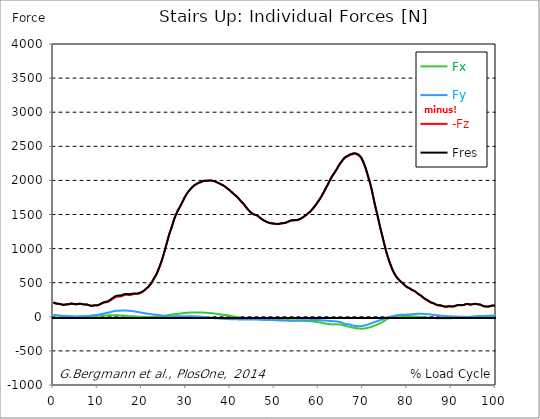
| Category |  Fx |  Fy |  -Fz |  Fres |
|---|---|---|---|---|
| 0.0 | -11.53 | 28.2 | 209.26 | 211.65 |
| 0.16678370786516855 | -11.85 | 26.92 | 203.89 | 206.22 |
| 0.3335674157303371 | -12.14 | 25.68 | 198.67 | 200.94 |
| 0.5003511235955057 | -12.11 | 24.81 | 194.82 | 197.05 |
| 0.6671348314606742 | -11.91 | 24.05 | 192.67 | 194.83 |
| 0.8339185393258427 | -11.54 | 23.12 | 191.37 | 193.39 |
| 1.0007022471910114 | -10.95 | 21.97 | 190.48 | 192.33 |
| 1.1674859550561796 | -10.47 | 20.67 | 189.67 | 191.36 |
| 1.3342696629213484 | -10.3 | 19.49 | 188.26 | 189.83 |
| 1.5010533707865168 | -10.23 | 18.35 | 186.27 | 187.77 |
| 1.6678370786516854 | -10.17 | 17.4 | 183.74 | 185.17 |
| 1.8346207865168538 | -9.87 | 16.62 | 180.96 | 182.32 |
| 2.001404494382023 | -9.23 | 15.96 | 177.73 | 179.05 |
| 2.1681882022471908 | -8.56 | 15.29 | 175.13 | 176.38 |
| 2.334971910112359 | -7.76 | 14.66 | 175.02 | 176.17 |
| 2.501755617977528 | -6.6 | 14.11 | 176.58 | 177.63 |
| 2.668539325842697 | -5.42 | 13.29 | 178.97 | 179.88 |
| 2.8353230337078656 | -4.76 | 12.3 | 181.16 | 181.97 |
| 3.0021067415730336 | -4.62 | 11.53 | 181.84 | 182.61 |
| 3.168890449438202 | -4.35 | 10.82 | 181.68 | 182.43 |
| 3.335674157303371 | -3.88 | 10.19 | 181.5 | 182.2 |
| 3.502457865168539 | -3 | 9.54 | 183.97 | 184.62 |
| 3.6692415730337076 | -2.32 | 8.86 | 186.81 | 187.4 |
| 3.8360252808988764 | -1.48 | 8.12 | 190.52 | 191.08 |
| 4.002808988764046 | -0.73 | 7.49 | 193.32 | 193.86 |
| 4.169592696629214 | -0.25 | 7.06 | 193.45 | 193.97 |
| 4.3363764044943816 | 0.02 | 6.71 | 191.63 | 192.14 |
| 4.50316011235955 | 0.16 | 6.46 | 189.56 | 190.06 |
| 4.669943820224718 | 0.22 | 6.24 | 186.83 | 187.33 |
| 4.836727528089888 | 0.41 | 6.04 | 184.47 | 184.98 |
| 5.003511235955056 | 1.09 | 5.85 | 183.72 | 184.24 |
| 5.170294943820225 | 2.03 | 5.68 | 183.88 | 184.4 |
| 5.337078651685394 | 2.83 | 5.51 | 184.93 | 185.46 |
| 5.5038623595505625 | 3.57 | 5.26 | 186.77 | 187.3 |
| 5.670646067415731 | 4.2 | 5 | 189.09 | 189.62 |
| 5.837429775280899 | 4.8 | 4.72 | 191.52 | 192.04 |
| 6.004213483146067 | 5.15 | 4.67 | 192.17 | 192.69 |
| 6.170997191011236 | 5.5 | 4.92 | 190.86 | 191.39 |
| 6.329002808988764 | 5.8 | 5.18 | 188.92 | 189.46 |
| 6.495786516853932 | 6.45 | 5.58 | 186.42 | 186.97 |
| 6.662570224719101 | 7.27 | 6.23 | 183.37 | 183.95 |
| 6.82935393258427 | 7.99 | 6.77 | 180.98 | 181.61 |
| 6.9961376404494375 | 8.83 | 7.29 | 179.75 | 180.42 |
| 7.162921348314607 | 9.81 | 7.88 | 180.15 | 180.88 |
| 7.329705056179775 | 10.69 | 8.44 | 180.88 | 181.66 |
| 7.496488764044945 | 11.32 | 9.16 | 180.33 | 181.18 |
| 7.663272471910113 | 11.72 | 10.31 | 178.37 | 179.3 |
| 7.830056179775281 | 11.96 | 11.38 | 175.39 | 176.42 |
| 7.996839887640449 | 12.17 | 12.72 | 170.87 | 172.01 |
| 8.16362359550562 | 12.41 | 14.17 | 166.08 | 167.35 |
| 8.330407303370787 | 12.75 | 15.5 | 163.52 | 164.95 |
| 8.497191011235955 | 13.21 | 16.71 | 161.16 | 162.76 |
| 8.663974719101123 | 13.78 | 17.84 | 159.85 | 161.63 |
| 8.830758426966291 | 14.47 | 19.03 | 160.84 | 162.78 |
| 8.99754213483146 | 14.98 | 20.22 | 162.57 | 164.66 |
| 9.16432584269663 | 15.39 | 21.44 | 164.92 | 167.16 |
| 9.331109550561798 | 15.43 | 22.6 | 166.81 | 169.17 |
| 9.497893258426966 | 15.16 | 23.74 | 166.94 | 169.43 |
| 9.664676966292134 | 15.2 | 25.47 | 167 | 169.76 |
| 9.831460674157304 | 15.25 | 27.19 | 167.06 | 170.09 |
| 9.998244382022472 | 15.59 | 29.2 | 167.78 | 171.17 |
| 10.16502808988764 | 16.48 | 31.2 | 170.35 | 174.12 |
| 10.331811797752808 | 17.33 | 33.19 | 174.3 | 178.43 |
| 10.498595505617978 | 18.17 | 35.19 | 178.6 | 183.06 |
| 10.665379213483147 | 18.86 | 37.42 | 183.95 | 188.78 |
| 10.832162921348315 | 19.4 | 39.78 | 190.25 | 195.45 |
| 10.998946629213483 | 19.91 | 42.1 | 196.43 | 202 |
| 11.165730337078653 | 20.2 | 44.24 | 201.2 | 207.11 |
| 11.33251404494382 | 20.15 | 46.4 | 205.15 | 211.43 |
| 11.49929775280899 | 20.08 | 48.52 | 208.09 | 214.76 |
| 11.666081460674157 | 20.11 | 51.11 | 210.44 | 217.62 |
| 11.832865168539326 | 19.78 | 53.08 | 212.08 | 219.65 |
| 11.999648876404493 | 19.45 | 54.77 | 213.67 | 221.59 |
| 12.166432584269662 | 19.33 | 56.78 | 215.73 | 224.08 |
| 12.333216292134832 | 19.87 | 59.42 | 219.41 | 228.32 |
| 12.5 | 20.54 | 61.94 | 223.96 | 233.4 |
| 12.66678370786517 | 21.35 | 64.41 | 229.94 | 239.85 |
| 12.833567415730336 | 22.28 | 67.04 | 237.09 | 247.49 |
| 13.000351123595506 | 22.98 | 70.6 | 245.46 | 256.53 |
| 13.167134831460674 | 23.64 | 73.94 | 252.72 | 264.45 |
| 13.333918539325843 | 23.88 | 76.59 | 258.98 | 271.19 |
| 13.500702247191011 | 23.79 | 79.46 | 265.44 | 278.16 |
| 13.667485955056181 | 23.72 | 82.22 | 273.32 | 286.46 |
| 13.834269662921349 | 23.56 | 84.86 | 280.96 | 294.5 |
| 14.001053370786519 | 22.9 | 86.74 | 286.8 | 300.56 |
| 14.167837078651687 | 22.5 | 88.15 | 290.75 | 304.7 |
| 14.334620786516853 | 22.04 | 89.34 | 294.08 | 308.18 |
| 14.501404494382026 | 21.61 | 90.05 | 296.43 | 310.61 |
| 14.668188202247192 | 21.07 | 90.44 | 297.92 | 312.13 |
| 14.834971910112362 | 20.11 | 90.42 | 298.1 | 312.27 |
| 15.001755617977528 | 19.2 | 90.41 | 298.14 | 312.28 |
| 15.168539325842698 | 18.28 | 90.4 | 298.18 | 312.29 |
| 15.335323033707864 | 17.87 | 90.65 | 300.26 | 314.33 |
| 15.502106741573034 | 17.67 | 91.23 | 303.4 | 317.48 |
| 15.6688904494382 | 17.47 | 91.64 | 307.68 | 321.67 |
| 15.83567415730337 | 17.3 | 92.14 | 313.07 | 326.96 |
| 16.00245786516854 | 16.92 | 92.4 | 317.91 | 331.64 |
| 16.16924157303371 | 16.34 | 92.28 | 321.18 | 334.7 |
| 16.336025280898877 | 15.47 | 91.83 | 322.29 | 335.61 |
| 16.502808988764045 | 14.14 | 91.17 | 322.59 | 335.67 |
| 16.669592696629216 | 12.83 | 90.31 | 321.85 | 334.69 |
| 16.83637640449438 | 11.35 | 89.34 | 320.61 | 333.23 |
| 17.003160112359552 | 10.04 | 88.56 | 319.79 | 332.24 |
| 17.169943820224717 | 8.72 | 87.62 | 319.48 | 331.72 |
| 17.336727528089888 | 7.65 | 86.52 | 320.14 | 332.08 |
| 17.503511235955056 | 7.27 | 85.42 | 322.07 | 333.68 |
| 17.670294943820224 | 6.84 | 84.33 | 324.19 | 335.49 |
| 17.837078651685395 | 7 | 83.11 | 327.18 | 338.1 |
| 18.003862359550563 | 7.2 | 81.86 | 329.95 | 340.5 |
| 18.17064606741573 | 7.14 | 80.52 | 332.22 | 342.4 |
| 18.3374297752809 | 6.6 | 79 | 333.69 | 343.48 |
| 18.504213483146067 | 5.58 | 77.34 | 333.86 | 343.29 |
| 18.662219101123597 | 4.34 | 75.5 | 333.69 | 342.7 |
| 18.829002808988765 | 3.09 | 73.54 | 333.43 | 341.99 |
| 18.995786516853933 | 2.38 | 71.62 | 334.63 | 342.77 |
| 19.1625702247191 | 1.97 | 69.23 | 337.27 | 344.86 |
| 19.32935393258427 | 1.71 | 67.2 | 340.71 | 347.81 |
| 19.49613764044944 | 1.45 | 65.47 | 344.96 | 351.69 |
| 19.662921348314608 | 1.04 | 63.82 | 349.07 | 355.51 |
| 19.829705056179776 | 0.69 | 61.86 | 354.92 | 360.94 |
| 19.996488764044944 | 0.36 | 60.01 | 360.39 | 366.09 |
| 20.163272471910112 | -0.09 | 58.17 | 365.56 | 371 |
| 20.33005617977528 | -0.67 | 56.21 | 372.01 | 377.11 |
| 20.49683988764045 | -1.11 | 54.13 | 381.02 | 385.7 |
| 20.663623595505616 | -1.42 | 52.07 | 390.7 | 394.96 |
| 20.830407303370787 | -1.24 | 49.99 | 401.25 | 405.16 |
| 20.997191011235955 | -1.34 | 48.53 | 410.74 | 414.52 |
| 21.163974719101123 | -1.66 | 47.34 | 418.29 | 421.99 |
| 21.330758426966295 | -1.79 | 45.78 | 427.77 | 431.27 |
| 21.497542134831463 | -1.61 | 43.83 | 440.27 | 443.47 |
| 21.66432584269663 | -1.6 | 42.38 | 452.3 | 455.33 |
| 21.8311095505618 | -1.64 | 41.01 | 463.98 | 466.84 |
| 21.997893258426966 | -1.3 | 38.81 | 480.29 | 482.84 |
| 22.164676966292134 | -1.5 | 37.39 | 496.54 | 498.99 |
| 22.331460674157306 | -1.65 | 36.09 | 512.24 | 514.59 |
| 22.498244382022467 | -1.22 | 34.05 | 531.66 | 533.73 |
| 22.66502808988764 | -0.92 | 32.22 | 551.36 | 553.19 |
| 22.831811797752806 | -0.66 | 31 | 570.56 | 572.27 |
| 22.99859550561798 | -0.4 | 30.18 | 588.59 | 590.21 |
| 23.165379213483146 | -0.15 | 29.59 | 605.98 | 607.51 |
| 23.332162921348313 | 0.1 | 29.29 | 625.87 | 627.31 |
| 23.49894662921348 | 0.55 | 27.98 | 651.34 | 652.64 |
| 23.665730337078653 | 1.51 | 26.26 | 678.41 | 679.55 |
| 23.83251404494382 | 2.8 | 24.74 | 705.53 | 706.54 |
| 23.999297752808985 | 4.63 | 23.78 | 732.58 | 733.52 |
| 24.166081460674157 | 5.95 | 22.74 | 760.57 | 761.45 |
| 24.332865168539325 | 6.86 | 21.19 | 791.42 | 792.22 |
| 24.499648876404496 | 7.64 | 19.65 | 823.54 | 824.27 |
| 24.666432584269664 | 8.87 | 17.79 | 858.5 | 859.16 |
| 24.833216292134832 | 10.22 | 15.81 | 894.52 | 895.12 |
| 25.0 | 11.71 | 14.44 | 929.39 | 929.95 |
| 25.16678370786517 | 13.39 | 13.22 | 966.57 | 967.13 |
| 25.33356741573034 | 15.62 | 11.97 | 1007.73 | 1008.3 |
| 25.500351123595504 | 18.11 | 10.97 | 1047.04 | 1047.64 |
| 25.66713483146067 | 20.63 | 10.33 | 1086.83 | 1087.48 |
| 25.833918539325843 | 22.8 | 9.66 | 1124.01 | 1124.72 |
| 26.00070224719101 | 25.61 | 8.37 | 1165.04 | 1165.81 |
| 26.16748595505618 | 27.84 | 7.18 | 1201.9 | 1202.73 |
| 26.334269662921347 | 29.58 | 6.49 | 1235.37 | 1236.25 |
| 26.50105337078652 | 30.51 | 6.06 | 1266.2 | 1267.09 |
| 26.667837078651687 | 31.84 | 5.84 | 1297.53 | 1298.46 |
| 26.834620786516858 | 33.7 | 5.69 | 1331.02 | 1332 |
| 27.001404494382022 | 35.36 | 5.87 | 1365.53 | 1366.56 |
| 27.16818820224719 | 36.86 | 6.39 | 1401.2 | 1402.26 |
| 27.334971910112362 | 38.31 | 6.75 | 1433.63 | 1434.72 |
| 27.50175561797753 | 39.43 | 6.74 | 1461.88 | 1462.99 |
| 27.668539325842698 | 40.43 | 6.62 | 1489.05 | 1490.18 |
| 27.835323033707866 | 41.24 | 6.46 | 1512.89 | 1514.02 |
| 28.002106741573037 | 42.17 | 6.46 | 1535.62 | 1536.76 |
| 28.168890449438205 | 43.15 | 6.65 | 1558.9 | 1560.05 |
| 28.335674157303373 | 44.18 | 7.16 | 1579.68 | 1580.82 |
| 28.502457865168537 | 45.2 | 7.78 | 1598.18 | 1599.3 |
| 28.669241573033705 | 46.36 | 8.4 | 1617.88 | 1618.99 |
| 28.836025280898877 | 47.55 | 8.64 | 1639.36 | 1640.47 |
| 29.002808988764052 | 49.2 | 8 | 1661.37 | 1662.48 |
| 29.169592696629213 | 50.99 | 7.25 | 1683.02 | 1684.12 |
| 29.336376404494384 | 52.84 | 6.61 | 1704.06 | 1705.16 |
| 29.50316011235955 | 54.66 | 6.09 | 1725.09 | 1726.2 |
| 29.669943820224724 | 56.05 | 6.79 | 1746.66 | 1747.79 |
| 29.836727528089884 | 57.79 | 6.92 | 1766.13 | 1767.28 |
| 30.003511235955056 | 58.81 | 7.18 | 1784.71 | 1785.87 |
| 30.170294943820224 | 59.6 | 7.17 | 1801.99 | 1803.16 |
| 30.337078651685395 | 60.45 | 6.77 | 1817.42 | 1818.6 |
| 30.503862359550563 | 61.04 | 6.68 | 1832.06 | 1833.25 |
| 30.670646067415728 | 61.26 | 6.48 | 1846.29 | 1847.47 |
| 30.837429775280903 | 61.69 | 6.21 | 1859.22 | 1860.41 |
| 30.99543539325843 | 62.24 | 6.41 | 1871.56 | 1872.75 |
| 31.162219101123597 | 62.76 | 6.88 | 1883.72 | 1884.92 |
| 31.32900280898876 | 62.89 | 7.29 | 1895.42 | 1896.61 |
| 31.495786516853936 | 62.83 | 7.54 | 1906.65 | 1907.83 |
| 31.6625702247191 | 63.19 | 7 | 1916.3 | 1917.48 |
| 31.82935393258427 | 63.29 | 6.58 | 1925.45 | 1926.63 |
| 31.996137640449433 | 63.01 | 6.32 | 1933.11 | 1934.27 |
| 32.162921348314605 | 62.94 | 5.93 | 1939.73 | 1940.88 |
| 32.329705056179776 | 63.16 | 5.63 | 1945.54 | 1946.69 |
| 32.49648876404494 | 63.76 | 5.26 | 1950.93 | 1952.1 |
| 32.66327247191011 | 64.03 | 4.88 | 1957.94 | 1959.12 |
| 32.83005617977528 | 63.1 | 4.5 | 1965 | 1966.13 |
| 32.996839887640455 | 62.64 | 3.87 | 1968.81 | 1969.92 |
| 33.16362359550562 | 62.67 | 2.98 | 1971.33 | 1972.44 |
| 33.330407303370784 | 62.82 | 2.09 | 1973.45 | 1974.56 |
| 33.497191011235955 | 62.64 | 1.18 | 1976.88 | 1977.98 |
| 33.66397471910113 | 62.46 | -0.04 | 1983.46 | 1984.55 |
| 33.83075842696629 | 62.15 | -1.06 | 1989.57 | 1990.64 |
| 33.997542134831455 | 61.23 | -1.78 | 1993.4 | 1994.44 |
| 34.164325842696634 | 60.39 | -2.81 | 1994.92 | 1995.93 |
| 34.3311095505618 | 59.66 | -3.89 | 1995.69 | 1996.69 |
| 34.49789325842697 | 59.14 | -4.83 | 1995.2 | 1996.18 |
| 34.66467696629213 | 58.66 | -5.76 | 1994.47 | 1995.45 |
| 34.831460674157306 | 58.05 | -6.66 | 1994.34 | 1995.3 |
| 34.99824438202247 | 57.16 | -7.71 | 1995.36 | 1996.3 |
| 35.16502808988764 | 56.14 | -9.06 | 1997.15 | 1998.08 |
| 35.331811797752806 | 55.16 | -10.35 | 1998.65 | 1999.55 |
| 35.49859550561798 | 54.31 | -11.45 | 1998.49 | 1999.38 |
| 35.66537921348315 | 53.59 | -12.59 | 1997.33 | 1998.21 |
| 35.83216292134831 | 52.98 | -13.96 | 1994.9 | 1995.78 |
| 35.998946629213485 | 52.28 | -15.37 | 1992.03 | 1992.91 |
| 36.16573033707865 | 50.98 | -16.64 | 1990.91 | 1991.78 |
| 36.33251404494382 | 49.63 | -17.93 | 1989.81 | 1990.66 |
| 36.499297752808985 | 47.76 | -19.13 | 1986.02 | 1986.84 |
| 36.666081460674164 | 45.8 | -20.57 | 1982.01 | 1982.81 |
| 36.83286516853932 | 43.85 | -21.72 | 1976.86 | 1977.64 |
| 36.99964887640449 | 41.7 | -22.59 | 1971.07 | 1971.81 |
| 37.166432584269664 | 39.97 | -23.36 | 1966 | 1966.74 |
| 37.333216292134836 | 38.34 | -24.05 | 1960.74 | 1961.46 |
| 37.5 | 36.91 | -24.49 | 1955.01 | 1955.73 |
| 37.666783707865164 | 35.86 | -25.33 | 1949.31 | 1950.02 |
| 37.833567415730336 | 34.75 | -26.09 | 1943.67 | 1944.38 |
| 38.00035112359551 | 33.2 | -26.87 | 1939.57 | 1940.26 |
| 38.16713483146068 | 31.5 | -27.81 | 1935.5 | 1936.16 |
| 38.333918539325836 | 29.54 | -28.61 | 1929.4 | 1930.05 |
| 38.50070224719101 | 27.8 | -29.39 | 1923.01 | 1923.65 |
| 38.66748595505618 | 26.21 | -30.37 | 1916.09 | 1916.72 |
| 38.83426966292135 | 24.91 | -31.26 | 1907.55 | 1908.18 |
| 39.001053370786515 | 24.05 | -32.04 | 1898.22 | 1898.86 |
| 39.16783707865169 | 22.89 | -32.59 | 1889.38 | 1890 |
| 39.33462078651686 | 21.49 | -33.18 | 1881.83 | 1882.44 |
| 39.50140449438202 | 19.97 | -33.57 | 1874.65 | 1875.25 |
| 39.668188202247194 | 18.2 | -34.14 | 1866.28 | 1866.87 |
| 39.83497191011236 | 16.24 | -34.69 | 1856.79 | 1857.37 |
| 40.00175561797753 | 14.24 | -35.11 | 1847.25 | 1847.83 |
| 40.168539325842694 | 12.23 | -35.4 | 1837.53 | 1838.09 |
| 40.335323033707866 | 10.39 | -35.66 | 1827.43 | 1827.99 |
| 40.50210674157304 | 8.51 | -35.98 | 1817.2 | 1817.77 |
| 40.6688904494382 | 6.63 | -36.33 | 1806.76 | 1807.32 |
| 40.83567415730337 | 4.81 | -36.69 | 1796.21 | 1796.78 |
| 41.00245786516854 | 2.81 | -37.08 | 1788.51 | 1789.08 |
| 41.16924157303371 | 0.85 | -37.44 | 1780.48 | 1781.05 |
| 41.33602528089887 | -0.97 | -37.6 | 1770.71 | 1771.28 |
| 41.502808988764045 | -2.84 | -37.67 | 1760.05 | 1760.63 |
| 41.669592696629216 | -4.66 | -37.8 | 1749.42 | 1750.01 |
| 41.83637640449439 | -6.42 | -38 | 1738.67 | 1739.27 |
| 42.00316011235955 | -8.42 | -38.4 | 1726.61 | 1727.23 |
| 42.16994382022472 | -10.52 | -39.23 | 1712.52 | 1713.17 |
| 42.33672752808989 | -12.2 | -39.85 | 1699.39 | 1700.08 |
| 42.50351123595506 | -13.58 | -40.23 | 1686.78 | 1687.5 |
| 42.670294943820224 | -14.84 | -40.61 | 1676.33 | 1677.07 |
| 42.83707865168539 | -16.59 | -40.33 | 1666.25 | 1667 |
| 43.00386235955057 | -18.37 | -40.08 | 1656.01 | 1656.77 |
| 43.17064606741573 | -20 | -39.57 | 1642.65 | 1643.43 |
| 43.32865168539326 | -21.41 | -39.24 | 1627.77 | 1628.57 |
| 43.495435393258425 | -22.45 | -39.19 | 1612.62 | 1613.44 |
| 43.6622191011236 | -23.17 | -38.99 | 1598.61 | 1599.44 |
| 43.82900280898876 | -23.46 | -38.59 | 1586.17 | 1587 |
| 43.99578651685393 | -23.9 | -38.78 | 1573.88 | 1574.73 |
| 44.162570224719104 | -24.35 | -39.04 | 1561.73 | 1562.6 |
| 44.32935393258427 | -24.77 | -39.3 | 1549.96 | 1550.86 |
| 44.49613764044944 | -25.19 | -39.56 | 1538.2 | 1539.11 |
| 44.66292134831461 | -26.04 | -39.97 | 1528.07 | 1529.02 |
| 44.82970505617978 | -27.09 | -40.07 | 1518.85 | 1519.84 |
| 44.99648876404493 | -28.22 | -40.05 | 1511.41 | 1512.42 |
| 45.16327247191011 | -29.37 | -39.99 | 1504.79 | 1505.83 |
| 45.33005617977528 | -30.45 | -40.09 | 1500.54 | 1501.61 |
| 45.49683988764045 | -31.46 | -40.21 | 1496.87 | 1497.96 |
| 45.66362359550561 | -32.24 | -40.23 | 1492.44 | 1493.55 |
| 45.83040730337079 | -33.39 | -40.44 | 1490.51 | 1491.65 |
| 45.99719101123596 | -34.57 | -40.67 | 1488.72 | 1489.88 |
| 46.16397471910113 | -35.54 | -40.42 | 1483.33 | 1484.5 |
| 46.33075842696629 | -36.25 | -39.82 | 1473.62 | 1474.81 |
| 46.497542134831455 | -36.53 | -40.44 | 1463.19 | 1464.41 |
| 46.66432584269663 | -37.17 | -40.67 | 1454.61 | 1455.87 |
| 46.83110955056179 | -37.42 | -41.26 | 1446.27 | 1447.57 |
| 46.99789325842696 | -37.95 | -41.51 | 1437.17 | 1438.51 |
| 47.164676966292134 | -38.47 | -41.74 | 1429.46 | 1430.82 |
| 47.331460674157306 | -39.27 | -41.64 | 1422.44 | 1423.83 |
| 47.49824438202247 | -40.22 | -41.46 | 1415.82 | 1417.25 |
| 47.66502808988764 | -41.05 | -41.6 | 1409.86 | 1411.32 |
| 47.83181179775281 | -42.01 | -41.72 | 1404.43 | 1405.94 |
| 47.99859550561797 | -43.04 | -41.92 | 1399.92 | 1401.47 |
| 48.16537921348314 | -43.03 | -43.07 | 1393.33 | 1394.91 |
| 48.33216292134831 | -43 | -43.99 | 1387.58 | 1389.19 |
| 48.498946629213485 | -43.4 | -44.34 | 1383.87 | 1385.51 |
| 48.66573033707865 | -43.66 | -44.61 | 1380 | 1381.67 |
| 48.83251404494382 | -43.72 | -45.19 | 1376.37 | 1378.06 |
| 48.99929775280899 | -43.75 | -45.92 | 1372.91 | 1374.63 |
| 49.166081460674164 | -44.06 | -46.34 | 1370.85 | 1372.6 |
| 49.33286516853933 | -44.52 | -46.59 | 1369.05 | 1370.83 |
| 49.499648876404486 | -45.03 | -47.11 | 1367.6 | 1369.41 |
| 49.666432584269664 | -45.62 | -47.97 | 1366.62 | 1368.48 |
| 49.83321629213483 | -46.16 | -48.68 | 1365.61 | 1367.51 |
| 50.0 | -46.51 | -49.16 | 1364.37 | 1366.3 |
| 50.166783707865164 | -46.53 | -49.51 | 1362.72 | 1364.66 |
| 50.33356741573034 | -46.52 | -49.83 | 1361.28 | 1363.22 |
| 50.50035112359551 | -46.5 | -50.35 | 1360.08 | 1362.04 |
| 50.66713483146068 | -46.69 | -51.2 | 1359.72 | 1361.72 |
| 50.83391853932584 | -47.17 | -51.9 | 1360.21 | 1362.26 |
| 51.00070224719101 | -47.67 | -52.5 | 1361.26 | 1363.36 |
| 51.16748595505618 | -48.03 | -53.11 | 1362.94 | 1365.07 |
| 51.33426966292134 | -48.36 | -53.67 | 1364.69 | 1366.86 |
| 51.50105337078652 | -48.45 | -53.75 | 1367.51 | 1369.68 |
| 51.66783707865169 | -48.58 | -53.84 | 1369.92 | 1372.09 |
| 51.83462078651686 | -48.69 | -54.03 | 1371.23 | 1373.42 |
| 52.00140449438202 | -48.74 | -54.31 | 1372.08 | 1374.27 |
| 52.168188202247194 | -49.01 | -54.81 | 1373.42 | 1375.64 |
| 52.33497191011236 | -49.29 | -55.23 | 1375.18 | 1377.42 |
| 52.50175561797752 | -49.61 | -55.44 | 1377.95 | 1380.2 |
| 52.668539325842694 | -49.94 | -55.44 | 1381.43 | 1383.68 |
| 52.835323033707866 | -50.2 | -55.73 | 1385.44 | 1387.71 |
| 53.00210674157304 | -50.65 | -55.92 | 1390.76 | 1393.04 |
| 53.1688904494382 | -51.17 | -56.23 | 1396.2 | 1398.49 |
| 53.33567415730337 | -51.79 | -56.7 | 1401.77 | 1404.09 |
| 53.502457865168545 | -52.15 | -57.61 | 1406.2 | 1408.56 |
| 53.669241573033716 | -52.6 | -58.6 | 1409.7 | 1412.11 |
| 53.83602528089887 | -53.11 | -59.08 | 1411.81 | 1414.24 |
| 54.002808988764045 | -53.34 | -59.51 | 1412.66 | 1415.11 |
| 54.169592696629216 | -53.63 | -59.66 | 1413.82 | 1416.29 |
| 54.33637640449438 | -53.82 | -59.29 | 1414.17 | 1416.64 |
| 54.50316011235955 | -54.01 | -58.96 | 1414.75 | 1417.22 |
| 54.669943820224724 | -54.26 | -58.47 | 1415.42 | 1417.87 |
| 54.836727528089895 | -54.52 | -57.83 | 1415.83 | 1418.26 |
| 55.00351123595506 | -54.79 | -57.11 | 1416.43 | 1418.84 |
| 55.17029494382022 | -55.08 | -55.77 | 1418.49 | 1420.85 |
| 55.337078651685395 | -55.37 | -54.52 | 1420.8 | 1423.11 |
| 55.50386235955056 | -55.75 | -53.88 | 1424.91 | 1427.22 |
| 55.66186797752809 | -56.14 | -53.15 | 1429.35 | 1431.64 |
| 55.82865168539326 | -56.51 | -52.54 | 1434.62 | 1436.89 |
| 55.995435393258425 | -56.9 | -51.97 | 1440.42 | 1442.69 |
| 56.1622191011236 | -57.38 | -51.4 | 1446.53 | 1448.79 |
| 56.32900280898877 | -58.08 | -50.82 | 1453.38 | 1455.64 |
| 56.49578651685393 | -58.9 | -50.37 | 1460.71 | 1462.97 |
| 56.6625702247191 | -59.57 | -50.3 | 1467.91 | 1470.17 |
| 56.82935393258427 | -60.15 | -50.43 | 1475.01 | 1477.29 |
| 56.99613764044943 | -60.72 | -50.66 | 1482.5 | 1484.8 |
| 57.16292134831461 | -61.35 | -50.5 | 1490.87 | 1493.17 |
| 57.329705056179776 | -61.85 | -50.17 | 1500.35 | 1502.63 |
| 57.49648876404495 | -62.43 | -49.86 | 1510.73 | 1513 |
| 57.66327247191011 | -63.07 | -49.61 | 1520.6 | 1522.86 |
| 57.83005617977529 | -63.95 | -49.19 | 1528.12 | 1530.38 |
| 57.99683988764044 | -65.1 | -48.7 | 1536.16 | 1538.43 |
| 58.16362359550561 | -65.94 | -48.4 | 1545.82 | 1548.09 |
| 58.33040730337079 | -66.64 | -47.85 | 1557.99 | 1560.25 |
| 58.497191011235955 | -67.44 | -47.38 | 1571.88 | 1574.15 |
| 58.66397471910112 | -68.42 | -46.72 | 1584.37 | 1586.65 |
| 58.83075842696629 | -69.38 | -46.22 | 1597.2 | 1599.49 |
| 58.99754213483147 | -70.26 | -46.16 | 1611 | 1613.32 |
| 59.164325842696634 | -71.15 | -46.1 | 1624.81 | 1627.14 |
| 59.33110955056179 | -72.74 | -45.79 | 1639.24 | 1641.6 |
| 59.49789325842697 | -74.47 | -45.57 | 1654.1 | 1656.5 |
| 59.664676966292134 | -76.16 | -46 | 1670.23 | 1672.71 |
| 59.8314606741573 | -77.77 | -46.69 | 1686.21 | 1688.77 |
| 59.99824438202247 | -79.48 | -47.26 | 1701.06 | 1703.69 |
| 60.16502808988765 | -81.3 | -47.8 | 1717.13 | 1719.84 |
| 60.33181179775281 | -83.19 | -48.42 | 1734.05 | 1736.84 |
| 60.49859550561798 | -85.2 | -49.26 | 1751 | 1753.88 |
| 60.66537921348315 | -87.32 | -50.31 | 1769.72 | 1772.71 |
| 60.83216292134831 | -89.39 | -51.32 | 1789.97 | 1793.05 |
| 60.99894662921348 | -91.45 | -52.38 | 1809.6 | 1812.79 |
| 61.16573033707864 | -93.46 | -53.12 | 1827.85 | 1831.12 |
| 61.33251404494383 | -95.68 | -53.99 | 1847.69 | 1851.06 |
| 61.49929775280899 | -97.81 | -54.93 | 1868.43 | 1871.9 |
| 61.66608146067416 | -100.32 | -55.6 | 1889.84 | 1893.42 |
| 61.83286516853932 | -102.6 | -56.37 | 1910.71 | 1914.39 |
| 61.99964887640451 | -104.58 | -57.53 | 1931.22 | 1935 |
| 62.16643258426967 | -106.26 | -58.51 | 1950.1 | 1953.97 |
| 62.33321629213482 | -107.83 | -59.79 | 1972.91 | 1976.87 |
| 62.5 | -109.38 | -61.07 | 1995.7 | 1999.74 |
| 62.66678370786517 | -110.31 | -62.14 | 2016.21 | 2020.29 |
| 62.833567415730336 | -110.71 | -62.98 | 2036.09 | 2040.17 |
| 63.0003511235955 | -111.33 | -63.79 | 2055.6 | 2059.69 |
| 63.16713483146068 | -111.62 | -64.29 | 2072.48 | 2076.57 |
| 63.33391853932585 | -111.3 | -64.56 | 2088.37 | 2092.42 |
| 63.500702247191015 | -111.15 | -65.05 | 2104.16 | 2108.18 |
| 63.66748595505618 | -110.9 | -65.74 | 2119.46 | 2123.46 |
| 63.83426966292135 | -110.83 | -66.45 | 2137.16 | 2141.15 |
| 64.00105337078651 | -110.85 | -67.64 | 2154.8 | 2158.8 |
| 64.16783707865169 | -110.85 | -68.96 | 2171.95 | 2175.97 |
| 64.33462078651687 | -111.26 | -70.77 | 2191.93 | 2196 |
| 64.50140449438203 | -111.94 | -72.86 | 2211.92 | 2216.06 |
| 64.6681882022472 | -112.42 | -75.08 | 2228.96 | 2233.16 |
| 64.83497191011236 | -112.96 | -77.72 | 2243.79 | 2248.1 |
| 65.00175561797754 | -114.11 | -80.36 | 2257.9 | 2262.34 |
| 65.16853932584269 | -116.11 | -84.39 | 2272.46 | 2277.16 |
| 65.33532303370787 | -119.21 | -88.91 | 2287.04 | 2292.09 |
| 65.50210674157304 | -123.08 | -93.4 | 2302.16 | 2307.6 |
| 65.66889044943821 | -126.68 | -98.16 | 2314.7 | 2320.52 |
| 65.83567415730337 | -130.56 | -102.29 | 2325.9 | 2332.08 |
| 66.00245786516854 | -134.23 | -106.1 | 2335.9 | 2342.42 |
| 66.1692415730337 | -136.18 | -107.51 | 2341.44 | 2348.12 |
| 66.33602528089888 | -138 | -108.12 | 2346.47 | 2353.26 |
| 66.50280898876404 | -140.48 | -108.67 | 2351.58 | 2358.52 |
| 66.66959269662921 | -143.44 | -109.45 | 2358.16 | 2365.29 |
| 66.83637640449439 | -146.21 | -110.71 | 2364.77 | 2372.11 |
| 67.00316011235955 | -148.29 | -112.95 | 2370.61 | 2378.17 |
| 67.16994382022472 | -150.72 | -115.66 | 2375.85 | 2383.68 |
| 67.33672752808988 | -152.91 | -118.63 | 2379.33 | 2387.44 |
| 67.50351123595506 | -155.47 | -122.07 | 2380.47 | 2388.91 |
| 67.67029494382022 | -157.88 | -125.44 | 2384.33 | 2393.09 |
| 67.83707865168539 | -159.82 | -128.42 | 2388.38 | 2397.41 |
| 67.99508426966291 | -161.38 | -130.74 | 2389.68 | 2398.92 |
| 68.16186797752809 | -163.74 | -132.98 | 2389.62 | 2399.14 |
| 68.32865168539327 | -166.11 | -135.02 | 2387.8 | 2397.6 |
| 68.49543539325843 | -167.86 | -136.5 | 2383.69 | 2393.71 |
| 68.6622191011236 | -168.84 | -137.63 | 2379.49 | 2389.66 |
| 68.82900280898876 | -169.74 | -138.16 | 2373.85 | 2384.11 |
| 68.99578651685394 | -170.73 | -138.39 | 2366.86 | 2377.22 |
| 69.1625702247191 | -171.54 | -138.61 | 2358.35 | 2368.81 |
| 69.32935393258425 | -172.81 | -138.59 | 2349.06 | 2359.64 |
| 69.49613764044945 | -173.65 | -137.11 | 2336.66 | 2347.26 |
| 69.66292134831461 | -173.91 | -135.66 | 2318.91 | 2329.51 |
| 69.82970505617978 | -173.69 | -134.46 | 2297.5 | 2308.1 |
| 69.99648876404494 | -173.26 | -133.22 | 2275.39 | 2285.99 |
| 70.16327247191012 | -172.51 | -130.66 | 2249.92 | 2260.43 |
| 70.33005617977528 | -170.92 | -127.77 | 2221.82 | 2232.18 |
| 70.49683988764045 | -169.48 | -124.75 | 2193.49 | 2203.7 |
| 70.66362359550561 | -168.09 | -121.7 | 2162.16 | 2172.22 |
| 70.83040730337079 | -165.97 | -118.25 | 2126.6 | 2136.48 |
| 70.99719101123596 | -163.37 | -114.49 | 2088.94 | 2098.58 |
| 71.16397471910112 | -160.42 | -110.8 | 2051.28 | 2060.66 |
| 71.3307584269663 | -157.44 | -107.41 | 2015.33 | 2024.46 |
| 71.49754213483146 | -154.39 | -104.16 | 1979.82 | 1988.68 |
| 71.66432584269663 | -151.38 | -100.42 | 1941.14 | 1949.74 |
| 71.83110955056179 | -148.13 | -96.28 | 1898.57 | 1906.89 |
| 71.99789325842697 | -144.44 | -92.02 | 1852.3 | 1860.31 |
| 72.16467696629215 | -140.26 | -87.9 | 1802.01 | 1809.72 |
| 72.3314606741573 | -136.14 | -83.78 | 1751.36 | 1758.76 |
| 72.49824438202248 | -132.07 | -80.04 | 1700.49 | 1707.6 |
| 72.66502808988764 | -128.08 | -76.48 | 1651.27 | 1658.1 |
| 72.8318117977528 | -123.97 | -72.72 | 1604 | 1610.54 |
| 72.99859550561797 | -119.65 | -69.15 | 1557.98 | 1564.2 |
| 73.16537921348315 | -115.16 | -65.58 | 1515.22 | 1521.1 |
| 73.33216292134833 | -110.69 | -61.96 | 1468.23 | 1473.78 |
| 73.49894662921349 | -106.09 | -58.31 | 1419.61 | 1424.84 |
| 73.66573033707864 | -100.96 | -54.33 | 1373.28 | 1378.13 |
| 73.83251404494382 | -95.47 | -50.4 | 1327.13 | 1331.59 |
| 73.99929775280899 | -90.24 | -46 | 1281.06 | 1285.12 |
| 74.16608146067415 | -84.89 | -41.68 | 1236.56 | 1240.24 |
| 74.33286516853933 | -78.68 | -37.35 | 1193.52 | 1196.76 |
| 74.49964887640449 | -72.4 | -33.01 | 1150.42 | 1153.24 |
| 74.66643258426967 | -65.87 | -28.62 | 1106.97 | 1109.38 |
| 74.83321629213484 | -58.98 | -23.99 | 1063.55 | 1065.55 |
| 75.0 | -51.86 | -19.77 | 1022.81 | 1024.44 |
| 75.16678370786516 | -44.29 | -15.19 | 981.16 | 982.41 |
| 75.33356741573033 | -36.63 | -10.73 | 939.84 | 940.74 |
| 75.5003511235955 | -30.37 | -7.36 | 903.6 | 904.25 |
| 75.66713483146067 | -24.31 | -4.28 | 867.73 | 868.18 |
| 75.83391853932585 | -18.77 | -1.6 | 835.22 | 835.55 |
| 76.00070224719101 | -13.79 | 0.81 | 804.42 | 804.64 |
| 76.16748595505618 | -9.83 | 2.83 | 775.86 | 776.01 |
| 76.33426966292136 | -6.25 | 4.64 | 746.76 | 746.89 |
| 76.50105337078652 | -2.78 | 6.4 | 718.02 | 718.13 |
| 76.66783707865167 | -0.1 | 8.17 | 692.89 | 693.02 |
| 76.83462078651685 | 2.42 | 10.07 | 670.21 | 670.37 |
| 77.00140449438202 | 4.56 | 12.48 | 649.42 | 649.65 |
| 77.1681882022472 | 6.72 | 14.86 | 628.51 | 628.81 |
| 77.33497191011236 | 9.08 | 17.59 | 609.52 | 609.92 |
| 77.50175561797754 | 11.1 | 20 | 592.1 | 592.62 |
| 77.6685393258427 | 12.49 | 21.71 | 578.27 | 578.88 |
| 77.83532303370787 | 13.43 | 23.32 | 564.93 | 565.63 |
| 78.00210674157303 | 13.43 | 24.7 | 552.3 | 553.07 |
| 78.1688904494382 | 13.55 | 26.19 | 539.73 | 540.59 |
| 78.33567415730337 | 14.19 | 27.85 | 527.84 | 528.83 |
| 78.50245786516854 | 15.03 | 29.19 | 517.73 | 518.82 |
| 78.66924157303372 | 15.31 | 29.86 | 508.42 | 509.58 |
| 78.83602528089888 | 15.28 | 30.2 | 499.39 | 500.59 |
| 79.00280898876404 | 15.19 | 30.56 | 490.89 | 492.12 |
| 79.16959269662921 | 14.56 | 30.49 | 480.36 | 481.6 |
| 79.33637640449439 | 13.57 | 30.4 | 468.02 | 469.26 |
| 79.50316011235955 | 12.66 | 30.75 | 457.83 | 459.09 |
| 79.66994382022472 | 12.41 | 31.04 | 449.92 | 451.21 |
| 79.8367275280899 | 11.95 | 31.6 | 441.15 | 442.52 |
| 80.00351123595506 | 11.35 | 32.41 | 433.01 | 434.48 |
| 80.17029494382022 | 10.85 | 32.98 | 427.81 | 429.32 |
| 80.32830056179776 | 10.48 | 33.47 | 423.66 | 425.21 |
| 80.49508426966293 | 10.03 | 34.1 | 418.88 | 420.49 |
| 80.66186797752809 | 9.41 | 35.07 | 412.08 | 413.8 |
| 80.82865168539325 | 8.66 | 36.16 | 403.58 | 405.42 |
| 80.99543539325842 | 8.03 | 37.33 | 395.61 | 397.58 |
| 81.1622191011236 | 7.42 | 38.42 | 389.04 | 391.11 |
| 81.32900280898878 | 6.74 | 39.22 | 384.11 | 386.27 |
| 81.49578651685394 | 6.15 | 40.12 | 379.88 | 382.14 |
| 81.6625702247191 | 5.59 | 41.09 | 375.77 | 378.13 |
| 81.82935393258427 | 4.92 | 42.05 | 369.84 | 372.33 |
| 81.99613764044945 | 3.95 | 42.87 | 360.79 | 363.44 |
| 82.16292134831461 | 2.72 | 43.36 | 350.95 | 353.75 |
| 82.32970505617978 | 1.39 | 43.57 | 341.31 | 344.22 |
| 82.49648876404494 | 0.27 | 43.65 | 332.55 | 335.54 |
| 82.66327247191012 | -0.66 | 43.61 | 324.87 | 327.92 |
| 82.83005617977528 | -1.4 | 43.79 | 319.15 | 322.26 |
| 82.99683988764045 | -2.19 | 43.86 | 313.54 | 316.71 |
| 83.16362359550563 | -3.19 | 43.81 | 306.43 | 309.66 |
| 83.33040730337079 | -4.31 | 43.48 | 297.14 | 300.43 |
| 83.49719101123596 | -5.39 | 42.82 | 286.63 | 290 |
| 83.66397471910112 | -6.73 | 42.38 | 277.01 | 280.46 |
| 83.8307584269663 | -7.95 | 41.62 | 268.7 | 272.17 |
| 83.99754213483146 | -8.78 | 40.93 | 261.16 | 264.65 |
| 84.16432584269663 | -9.4 | 40.33 | 254.88 | 258.38 |
| 84.33110955056179 | -10.2 | 39.47 | 248.91 | 252.39 |
| 84.49789325842697 | -11.11 | 38.66 | 243.57 | 247.02 |
| 84.66467696629213 | -12.03 | 37.86 | 238.25 | 241.68 |
| 84.8314606741573 | -13.11 | 37.01 | 230.87 | 234.31 |
| 84.99824438202248 | -13.99 | 36.04 | 222.5 | 225.95 |
| 85.16502808988764 | -14.73 | 34.89 | 214.79 | 218.22 |
| 85.3318117977528 | -15.3 | 33.72 | 209.16 | 212.52 |
| 85.49859550561797 | -15.68 | 32.41 | 205.65 | 208.89 |
| 85.66537921348315 | -16.02 | 31 | 202.71 | 205.8 |
| 85.83216292134831 | -16.58 | 29.62 | 199.29 | 202.27 |
| 85.99894662921348 | -17.5 | 27.98 | 194.55 | 197.46 |
| 86.16573033707866 | -18.56 | 26.41 | 189.33 | 192.2 |
| 86.33251404494384 | -19.38 | 24.94 | 183.83 | 186.67 |
| 86.499297752809 | -19.85 | 23.73 | 178.24 | 181.08 |
| 86.66608146067415 | -20.15 | 22.56 | 173.48 | 176.27 |
| 86.83286516853933 | -20.24 | 21.66 | 169.88 | 172.63 |
| 86.99964887640449 | -20.24 | 20.72 | 167.54 | 170.21 |
| 87.16643258426966 | -20.12 | 19.64 | 166.49 | 169.03 |
| 87.33321629213482 | -19.93 | 18.65 | 165.8 | 168.23 |
| 87.5 | -19.91 | 17.56 | 165.34 | 167.69 |
| 87.66678370786518 | -20.17 | 16.37 | 163.92 | 166.21 |
| 87.83356741573033 | -20.87 | 15.19 | 160.85 | 163.16 |
| 88.00035112359551 | -21.54 | 14.17 | 157.6 | 159.95 |
| 88.16713483146067 | -22.27 | 12.98 | 153.44 | 155.85 |
| 88.33391853932584 | -22.76 | 11.92 | 149.49 | 151.94 |
| 88.500702247191 | -22.73 | 11.39 | 147.27 | 149.72 |
| 88.66748595505618 | -22.4 | 11.06 | 146.25 | 148.65 |
| 88.83426966292136 | -21.85 | 10.67 | 146.42 | 148.73 |
| 89.00105337078652 | -21.12 | 10.15 | 148.02 | 150.18 |
| 89.16783707865169 | -20.65 | 9.47 | 150.62 | 152.66 |
| 89.33462078651687 | -20.21 | 8.78 | 152.94 | 154.86 |
| 89.50140449438203 | -20.19 | 8.05 | 153.25 | 155.15 |
| 89.6681882022472 | -20.28 | 7.17 | 152.91 | 154.81 |
| 89.83497191011236 | -19.98 | 6.68 | 152.07 | 153.93 |
| 90.00175561797754 | -19.74 | 6.42 | 150.78 | 152.61 |
| 90.16853932584269 | -19.47 | 6.1 | 149.59 | 151.38 |
| 90.33532303370787 | -18.86 | 5.83 | 149.72 | 151.46 |
| 90.50210674157303 | -18.09 | 5.49 | 150.88 | 152.53 |
| 90.6688904494382 | -17 | 5.13 | 154.03 | 155.55 |
| 90.83567415730336 | -15.95 | 4.39 | 158.52 | 159.93 |
| 91.00245786516854 | -14.93 | 3.52 | 163.07 | 164.38 |
| 91.1692415730337 | -13.93 | 2.98 | 166.65 | 167.87 |
| 91.33602528089888 | -13.26 | 2.41 | 169.04 | 170.22 |
| 91.50280898876404 | -12.78 | 1.87 | 170.73 | 171.86 |
| 91.66959269662922 | -12.37 | 1.46 | 171.41 | 172.51 |
| 91.83637640449439 | -11.84 | 1.16 | 171.38 | 172.43 |
| 92.00316011235955 | -11.3 | 0.71 | 170.61 | 171.64 |
| 92.16994382022472 | -10.76 | 0.42 | 169.88 | 170.88 |
| 92.3367275280899 | -10.06 | 0.14 | 169.54 | 170.51 |
| 92.50351123595506 | -8.86 | 0.06 | 170.49 | 171.42 |
| 92.66151685393258 | -7.6 | 0.01 | 172.08 | 172.98 |
| 92.82830056179776 | -6.36 | -0.21 | 174.5 | 175.37 |
| 92.99508426966291 | -5.11 | -0.54 | 177.97 | 178.81 |
| 93.16186797752809 | -4.09 | -1.15 | 182.75 | 183.56 |
| 93.32865168539325 | -3.1 | -1.56 | 185.92 | 186.71 |
| 93.49543539325842 | -2.25 | -1.65 | 186.82 | 187.61 |
| 93.66221910112358 | -1.68 | -1.89 | 185.9 | 186.68 |
| 93.82900280898876 | -1.27 | -2.07 | 184.36 | 185.14 |
| 93.99578651685393 | -0.82 | -2.21 | 182.54 | 183.32 |
| 94.1625702247191 | -0.2 | -2.21 | 181.05 | 181.83 |
| 94.32935393258427 | 0.71 | -2.01 | 180.16 | 180.97 |
| 94.49613764044945 | 1.82 | -1.67 | 179.89 | 180.72 |
| 94.66292134831461 | 2.93 | -1.29 | 180.97 | 181.83 |
| 94.82970505617978 | 4.08 | -1.18 | 183.6 | 184.47 |
| 94.99648876404494 | 5.36 | -1.17 | 186.71 | 187.6 |
| 95.16327247191012 | 6.43 | -1.02 | 188.56 | 189.48 |
| 95.33005617977528 | 7.23 | -0.84 | 189.33 | 190.24 |
| 95.49683988764046 | 7.84 | -0.71 | 189.02 | 189.92 |
| 95.66362359550563 | 8.62 | -0.28 | 187.49 | 188.39 |
| 95.83040730337078 | 9.04 | 0.04 | 184.3 | 185.22 |
| 95.99719101123594 | 9.51 | 0.31 | 181.54 | 182.49 |
| 96.16397471910112 | 10.15 | 0.56 | 181.14 | 182.1 |
| 96.33075842696628 | 10.71 | 0.77 | 180.97 | 181.93 |
| 96.49754213483145 | 10.98 | 1.15 | 178.65 | 179.61 |
| 96.66432584269663 | 10.83 | 1.62 | 174.85 | 175.8 |
| 96.8311095505618 | 11.09 | 2.61 | 169.28 | 170.23 |
| 96.99789325842697 | 11.7 | 4.09 | 162.24 | 163.2 |
| 97.16467696629213 | 12.06 | 5.31 | 157.15 | 158.15 |
| 97.3314606741573 | 12.5 | 6.63 | 154.16 | 155.26 |
| 97.49824438202248 | 12.79 | 7.47 | 151.92 | 153.09 |
| 97.66502808988764 | 13.22 | 8.05 | 150.41 | 151.63 |
| 97.8318117977528 | 13.7 | 8.89 | 150.37 | 151.68 |
| 97.99859550561798 | 13.8 | 9.01 | 150 | 151.31 |
| 98.16537921348316 | 13.85 | 9.27 | 148.93 | 150.27 |
| 98.33216292134833 | 14.21 | 9.65 | 148.8 | 150.21 |
| 98.49894662921349 | 14.79 | 10.31 | 150.04 | 151.56 |
| 98.66573033707866 | 15.41 | 11.3 | 153.19 | 154.82 |
| 98.8325140449438 | 16.11 | 12.45 | 157.76 | 159.55 |
| 98.99929775280897 | 16.38 | 13.54 | 160.01 | 161.89 |
| 99.16608146067416 | 16.34 | 14.55 | 162.21 | 164.18 |
| 99.33286516853933 | 16.26 | 15.47 | 163.13 | 165.18 |
| 99.49964887640449 | 16.03 | 16.39 | 163.25 | 165.35 |
| 99.66643258426966 | 15.82 | 17.44 | 162.8 | 164.97 |
| 99.83321629213484 | 15.36 | 18.52 | 162.12 | 164.36 |
| 100.0 | 14.86 | 19.6 | 161.44 | 163.75 |